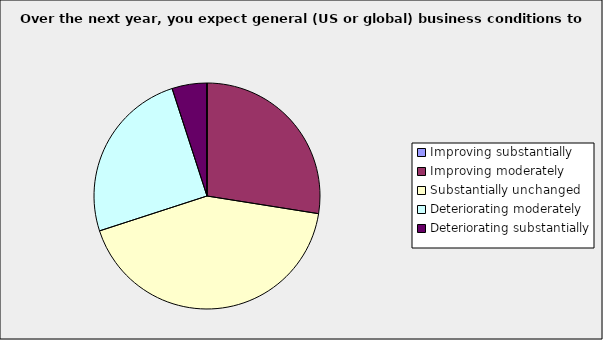
| Category | Series 0 |
|---|---|
| Improving substantially | 0 |
| Improving moderately | 0.275 |
| Substantially unchanged | 0.425 |
| Deteriorating moderately | 0.25 |
| Deteriorating substantially | 0.05 |